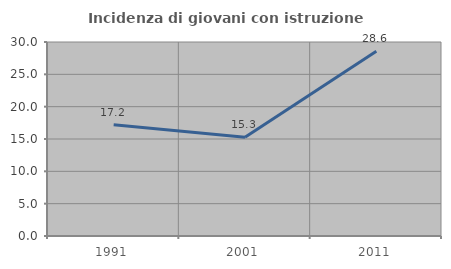
| Category | Incidenza di giovani con istruzione universitaria |
|---|---|
| 1991.0 | 17.188 |
| 2001.0 | 15.254 |
| 2011.0 | 28.571 |